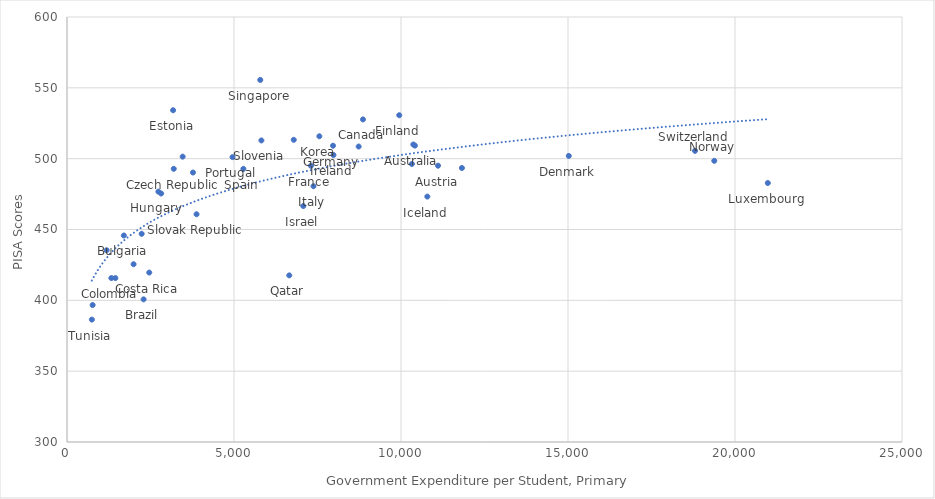
| Category | Series 0 |
|---|---|
| 10369.061975524763 | 509.994 |
| 11108.653364110249 | 495.037 |
| 2293.1456265546344 | 400.682 |
| 1701.955017800155 | 445.772 |
| 8861.478412553857 | 527.705 |
| 2235.2527839965715 | 446.956 |
| 1327.7507939091904 | 415.729 |
| 2463.0017979678155 | 419.608 |
| 3195.961602577793 | 492.83 |
| 15023.394613860055 | 501.937 |
| 3176.3202366904106 | 534.194 |
| 9947.722410740012 | 530.661 |
| 7303.88609763067 | 494.978 |
| 7964.644820205343 | 509.141 |
| 2735.9184691969167 | 476.748 |
| 10788.499762733134 | 473.23 |
| 7977.953926224639 | 502.575 |
| 7074.066931806244 | 466.553 |
| 7380.4992797505165 | 480.547 |
| 7555.63562770636 | 515.81 |
| 3772.0219908586055 | 490.225 |
| 2818.591844326528 | 475.409 |
| 20982.6948253914 | 482.806 |
| 1447.9536609311529 | 415.71 |
| 8732.246464438846 | 508.575 |
| 6789.373960939312 | 513.304 |
| 19379.425222005113 | 498.481 |
| 767.4932888107594 | 396.684 |
| 3462.8686564325476 | 501.435 |
| 4955.895134628146 | 501.1 |
| 6654.844344836327 | 417.611 |
| 5786.114310250177 | 555.575 |
| 3878.6565120238247 | 460.775 |
| 5820.4484454735675 | 512.864 |
| 5280.4498092153835 | 492.786 |
| 11823.681854215865 | 493.422 |
| 18802.75757639439 | 505.506 |
| 744.0071978269455 | 386.403 |
| 1993.1039286941748 | 425.49 |
| 10416.562450992526 | 509.222 |
| 10325.45697974216 | 496.242 |
| 1187.0790740059283 | 435.363 |